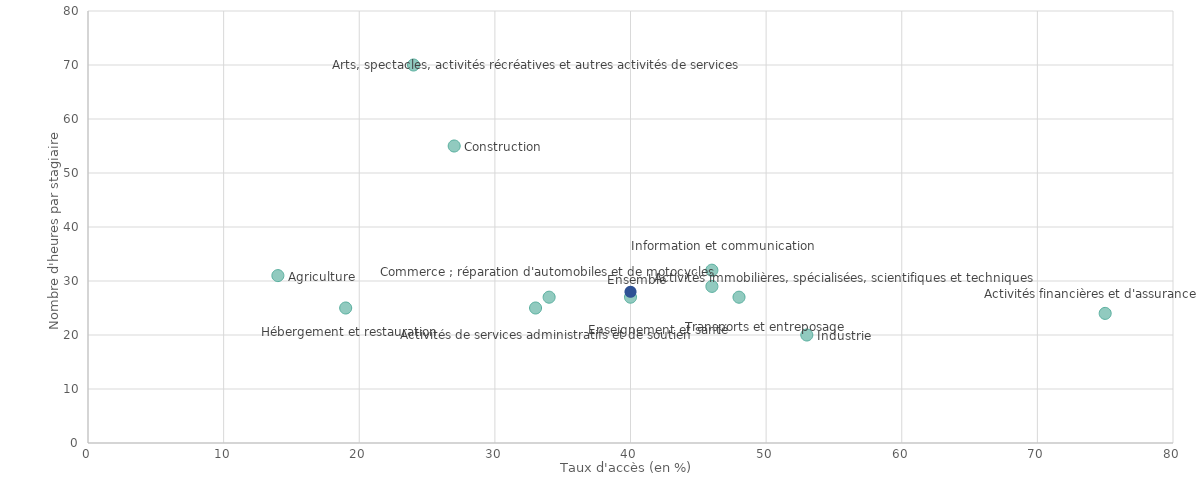
| Category | Secteur |
|---|---|
| 14.0 | 31 |
| 53.0 | 20 |
| 27.0 | 55 |
| 34.0 | 27 |
| 48.0 | 27 |
| 19.0 | 25 |
| 46.0 | 32 |
| 75.0 | 24 |
| 46.0 | 29 |
| 33.0 | 25 |
| 24.0 | 70 |
| 40.0 | 27 |
| 40.0 | 28 |